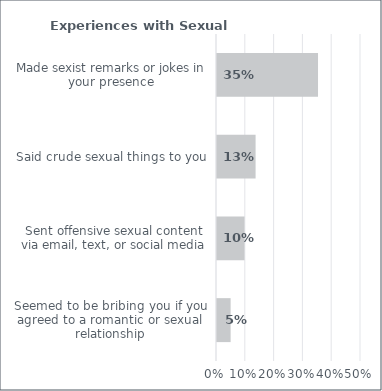
| Category | Series 0 |
|---|---|
| Seemed to be bribing you if you agreed to a romantic or sexual relationship | 0.047 |
| Sent offensive sexual content via email, text, or social media | 0.096 |
| Said crude sexual things to you | 0.134 |
| Made sexist remarks or jokes in your presence | 0.351 |